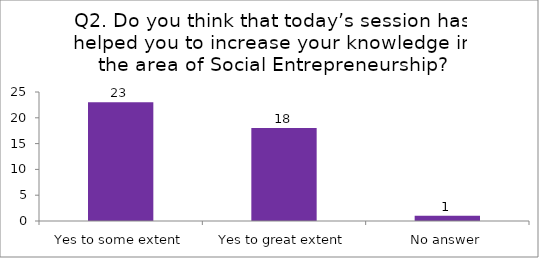
| Category | Q2. Do you think that today’s session have helped you to increase your knowledge in the area of Social Entrepreneurship? |
|---|---|
| Yes to some extent | 23 |
| Yes to great extent | 18 |
| No answer | 1 |